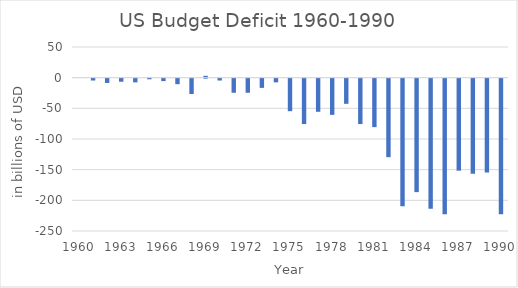
| Category | Series 0 |
|---|---|
| 1960.0 | 0 |
| 1961.0 | -3 |
| 1962.0 | -7 |
| 1963.0 | -5 |
| 1964.0 | -6 |
| 1965.0 | -1 |
| 1966.0 | -4 |
| 1967.0 | -9 |
| 1968.0 | -25 |
| 1969.0 | 3 |
| 1970.0 | -3 |
| 1971.0 | -23 |
| 1972.0 | -23 |
| 1973.0 | -15 |
| 1974.0 | -6 |
| 1975.0 | -53 |
| 1976.0 | -74 |
| 1977.0 | -54 |
| 1978.0 | -59 |
| 1979.0 | -41 |
| 1980.0 | -74 |
| 1981.0 | -79 |
| 1982.0 | -128 |
| 1983.0 | -208 |
| 1984.0 | -185 |
| 1985.0 | -212 |
| 1986.0 | -221 |
| 1987.0 | -150 |
| 1988.0 | -155 |
| 1989.0 | -153 |
| 1990.0 | -221 |